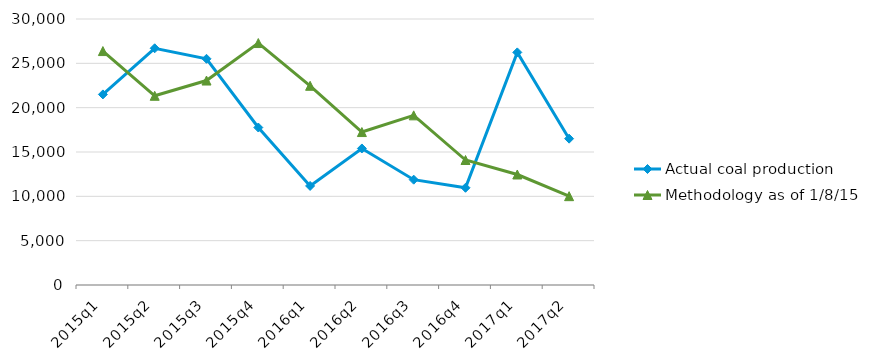
| Category | Actual coal production | Methodology as of 1/8/15 |
|---|---|---|
| 2015q1 | 21495 | 26383 |
| 2015q2 | 26696 | 21340 |
| 2015q3 | 25510 | 23059 |
| 2015q4 | 17761 | 27288 |
| 2016q1 | 11173 | 22467 |
| 2016q2 | 15399 | 17250 |
| 2016q3 | 11878 | 19134 |
| 2016q4 | 10965 | 14096 |
| 2017q1 | 26233 | 12463 |
| 2017q2 | 16505 | 10019 |